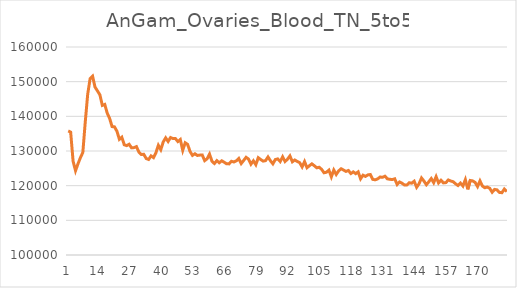
| Category | Series 1 |
|---|---|
| 0 | 135782 |
| 1 | 135445 |
| 2 | 127065 |
| 3 | 124306 |
| 4 | 126284 |
| 5 | 128062 |
| 6 | 129581 |
| 7 | 138427 |
| 8 | 146421 |
| 9 | 150908 |
| 10 | 151576 |
| 11 | 148433 |
| 12 | 147346 |
| 13 | 146203 |
| 14 | 143155 |
| 15 | 143439 |
| 16 | 140941 |
| 17 | 139397 |
| 18 | 137041 |
| 19 | 136964 |
| 20 | 135689 |
| 21 | 133375 |
| 22 | 133976 |
| 23 | 131792 |
| 24 | 131557 |
| 25 | 131946 |
| 26 | 130914 |
| 27 | 130981 |
| 28 | 131265 |
| 29 | 129702 |
| 30 | 128997 |
| 31 | 129051 |
| 32 | 127836 |
| 33 | 127559 |
| 34 | 128586 |
| 35 | 128098 |
| 36 | 129500 |
| 37 | 131643 |
| 38 | 130385 |
| 39 | 132612 |
| 40 | 133793 |
| 41 | 132750 |
| 42 | 133891 |
| 43 | 133586 |
| 44 | 133584 |
| 45 | 132721 |
| 46 | 133311 |
| 47 | 130197 |
| 48 | 132372 |
| 49 | 131906 |
| 50 | 129864 |
| 51 | 128727 |
| 52 | 129205 |
| 53 | 128713 |
| 54 | 128819 |
| 55 | 128866 |
| 56 | 127223 |
| 57 | 127747 |
| 58 | 129099 |
| 59 | 127023 |
| 60 | 126390 |
| 61 | 127218 |
| 62 | 126612 |
| 63 | 127176 |
| 64 | 126770 |
| 65 | 126303 |
| 66 | 126283 |
| 67 | 127027 |
| 68 | 126835 |
| 69 | 127167 |
| 70 | 127836 |
| 71 | 126383 |
| 72 | 127259 |
| 73 | 128187 |
| 74 | 127665 |
| 75 | 126201 |
| 76 | 127171 |
| 77 | 126052 |
| 78 | 128065 |
| 79 | 127548 |
| 80 | 127086 |
| 81 | 127223 |
| 82 | 128284 |
| 83 | 127182 |
| 84 | 126300 |
| 85 | 127536 |
| 86 | 127724 |
| 87 | 126963 |
| 88 | 128315 |
| 89 | 126958 |
| 90 | 127646 |
| 91 | 128579 |
| 92 | 126892 |
| 93 | 127409 |
| 94 | 126974 |
| 95 | 126648 |
| 96 | 125405 |
| 97 | 126945 |
| 98 | 125177 |
| 99 | 125761 |
| 100 | 126290 |
| 101 | 125758 |
| 102 | 125152 |
| 103 | 125316 |
| 104 | 124705 |
| 105 | 123717 |
| 106 | 123888 |
| 107 | 124486 |
| 108 | 122543 |
| 109 | 124520 |
| 110 | 123219 |
| 111 | 124268 |
| 112 | 124877 |
| 113 | 124510 |
| 114 | 124111 |
| 115 | 124376 |
| 116 | 123494 |
| 117 | 123971 |
| 118 | 123469 |
| 119 | 123980 |
| 120 | 121973 |
| 121 | 123022 |
| 122 | 122680 |
| 123 | 123111 |
| 124 | 123221 |
| 125 | 121811 |
| 126 | 121695 |
| 127 | 121947 |
| 128 | 122493 |
| 129 | 122419 |
| 130 | 122724 |
| 131 | 121972 |
| 132 | 121838 |
| 133 | 121759 |
| 134 | 121984 |
| 135 | 120338 |
| 136 | 121072 |
| 137 | 120698 |
| 138 | 120203 |
| 139 | 120199 |
| 140 | 120846 |
| 141 | 120716 |
| 142 | 121277 |
| 143 | 119530 |
| 144 | 120558 |
| 145 | 122219 |
| 146 | 121339 |
| 147 | 120263 |
| 148 | 121125 |
| 149 | 122053 |
| 150 | 120859 |
| 151 | 122597 |
| 152 | 120783 |
| 153 | 121568 |
| 154 | 120804 |
| 155 | 120880 |
| 156 | 121647 |
| 157 | 121343 |
| 158 | 121137 |
| 159 | 120522 |
| 160 | 120028 |
| 161 | 120733 |
| 162 | 119897 |
| 163 | 121741 |
| 164 | 118941 |
| 165 | 121495 |
| 166 | 121374 |
| 167 | 120947 |
| 168 | 119740 |
| 169 | 121383 |
| 170 | 119881 |
| 171 | 119402 |
| 172 | 119607 |
| 173 | 119232 |
| 174 | 118110 |
| 175 | 118913 |
| 176 | 118784 |
| 177 | 118050 |
| 178 | 117974 |
| 179 | 119034 |
| 180 | 118300 |